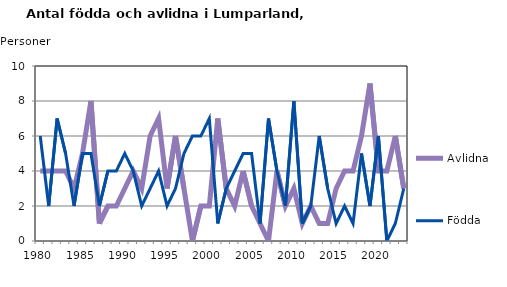
| Category | Avlidna | Födda |
|---|---|---|
| 1980.0 | 4 | 6 |
| 1981.0 | 4 | 2 |
| 1982.0 | 4 | 7 |
| 1983.0 | 4 | 5 |
| 1984.0 | 3 | 2 |
| 1985.0 | 5 | 5 |
| 1986.0 | 8 | 5 |
| 1987.0 | 1 | 2 |
| 1988.0 | 2 | 4 |
| 1989.0 | 2 | 4 |
| 1990.0 | 3 | 5 |
| 1991.0 | 4 | 4 |
| 1992.0 | 3 | 2 |
| 1993.0 | 6 | 3 |
| 1994.0 | 7 | 4 |
| 1995.0 | 3 | 2 |
| 1996.0 | 6 | 3 |
| 1997.0 | 3 | 5 |
| 1998.0 | 0 | 6 |
| 1999.0 | 2 | 6 |
| 2000.0 | 2 | 7 |
| 2001.0 | 7 | 1 |
| 2002.0 | 3 | 3 |
| 2003.0 | 2 | 4 |
| 2004.0 | 4 | 5 |
| 2005.0 | 2 | 5 |
| 2006.0 | 1 | 1 |
| 2007.0 | 0 | 7 |
| 2008.0 | 4 | 4 |
| 2009.0 | 2 | 2 |
| 2010.0 | 3 | 8 |
| 2011.0 | 1 | 1 |
| 2012.0 | 2 | 2 |
| 2013.0 | 1 | 6 |
| 2014.0 | 1 | 3 |
| 2015.0 | 3 | 1 |
| 2016.0 | 4 | 2 |
| 2017.0 | 4 | 1 |
| 2018.0 | 6 | 5 |
| 2019.0 | 9 | 2 |
| 2020.0 | 4 | 6 |
| 2021.0 | 4 | 0 |
| 2022.0 | 6 | 1 |
| 2023.0 | 3 | 3 |